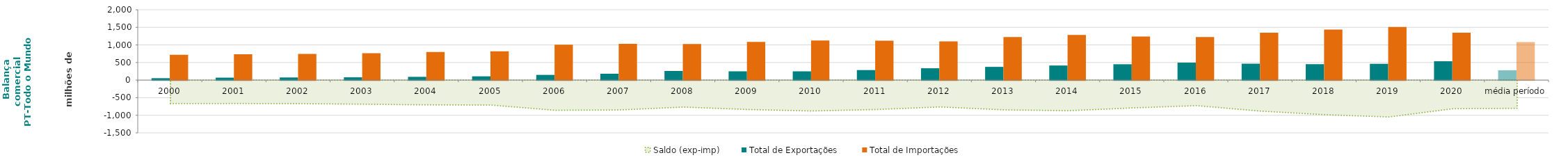
| Category | Total de Exportações  | Total de Importações  |
|---|---|---|
| 2000 | 54.251 | 721.259 |
| 2001 | 69.879 | 735.582 |
| 2002 | 75.158 | 744.048 |
| 2003 | 79.656 | 763.263 |
| 2004 | 92.953 | 796.951 |
| 2005 | 107.973 | 817.295 |
| 2006 | 148.058 | 1006.627 |
| 2007 | 180.515 | 1028.709 |
| 2008 | 259.579 | 1026.354 |
| 2009 | 249.432 | 1084.579 |
| 2010 | 249.295 | 1127.225 |
| 2011 | 285.356 | 1121.373 |
| 2012 | 336.709 | 1099.478 |
| 2013 | 376.062 | 1221.535 |
| 2014 | 414.884 | 1285.616 |
| 2015 | 450.666 | 1241.098 |
| 2016 | 496.378 | 1221.928 |
| 2017 | 466.755 | 1348.133 |
| 2018 | 452.591 | 1435.667 |
| 2019 | 463.518 | 1511.052 |
| 2020 | 535.894 | 1348.821 |
| média período | 278.36 | 1080.314 |